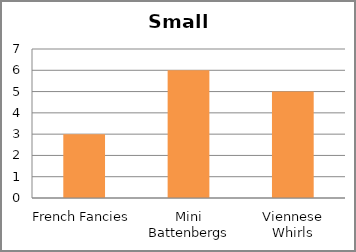
| Category | Small cakes |
|---|---|
| French Fancies | 3 |
| Mini Battenbergs | 6 |
| Viennese Whirls | 5 |